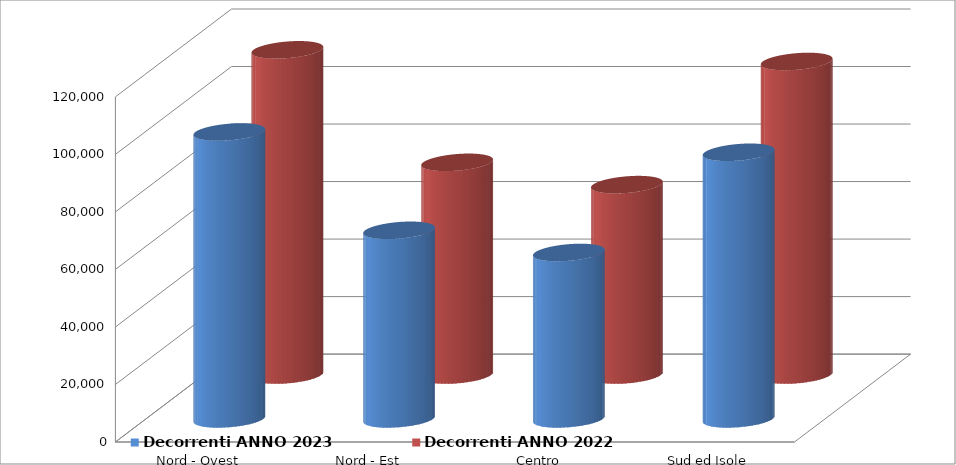
| Category | Decorrenti ANNO 2023 | Decorrenti ANNO 2022 |
|---|---|---|
| Nord - Ovest | 99783 | 113080 |
| Nord - Est | 65601 | 73955 |
| Centro | 57889 | 66205 |
| Sud ed Isole | 92728 | 109022 |